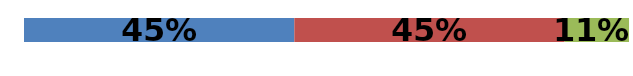
| Category | Series 0 | Series 1 | Series 2 |
|---|---|---|---|
| 0 | 0.447 | 0.447 | 0.106 |